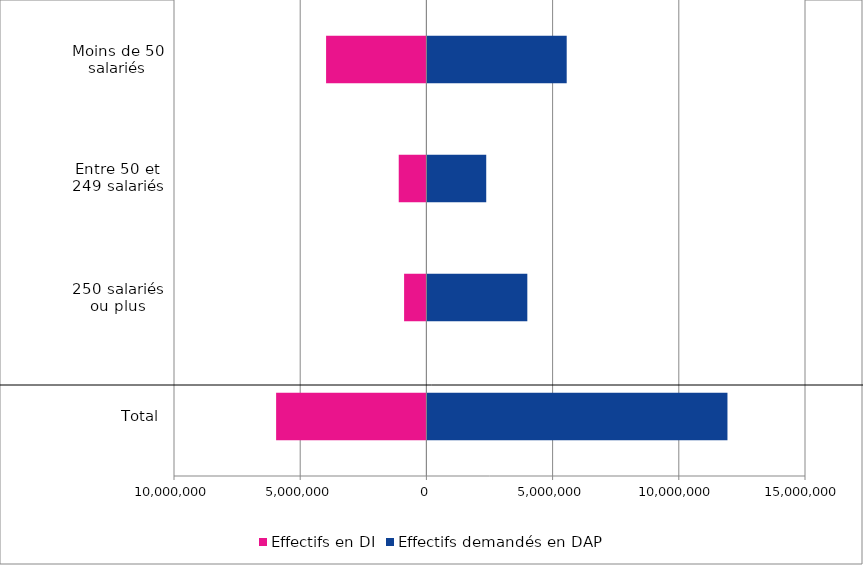
| Category | Effectifs en DI | Effectifs demandés en DAP |
|---|---|---|
| Total | -5954152 | 11927814 |
| 250 salariés ou plus | -883592 | 3998564 |
| Entre 50 et 249 salariés | -1096077 | 2370616 |
| Moins de 50 salariés | -3974483 | 5558634 |